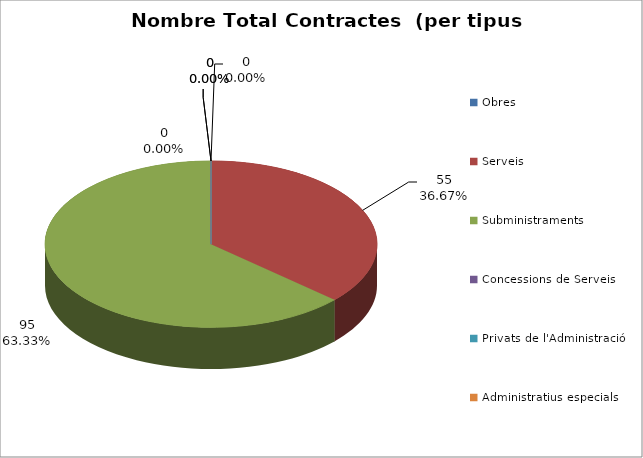
| Category | Nombre Total Contractes |
|---|---|
| Obres | 0 |
| Serveis | 55 |
| Subministraments | 95 |
| Concessions de Serveis | 0 |
| Privats de l'Administració | 0 |
| Administratius especials | 0 |